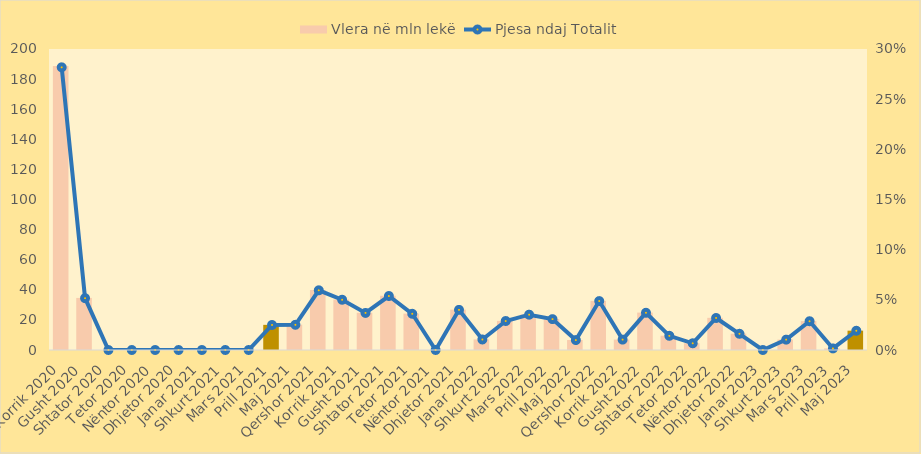
| Category | Vlera në mln lekë |
|---|---|
| Korrik 2020 | 188.7 |
| Gusht 2020 | 34.6 |
| Shtator 2020 | 0 |
| Tetor 2020 | 0 |
| Nëntor 2020 | 0 |
| Dhjetor 2020 | 0 |
| Janar 2021 | 0 |
| Shkurt 2021 | 0 |
| Mars 2021 | 0 |
| Prill 2021 | 16.709 |
| Maj 2021 | 16.827 |
| Qershor 2021 | 39.848 |
| Korrik 2021 | 33.536 |
| Gusht 2021 | 24.753 |
| Shtator 2021 | 36.031 |
| Tetor 2021 | 24.173 |
| Nëntor 2021 | 0 |
| Dhjetor 2021 | 26.801 |
| Janar 2022 | 7.027 |
| Shkurt 2022 | 19.349 |
| Mars 2022 | 23.574 |
| Prill 2022 | 20.609 |
| Maj 2022 | 6.626 |
| Qershor 2022 | 32.661 |
| Korrik 2022 | 6.931 |
| Gusht 2022 | 24.85 |
| Shtator 2022 | 9.475 |
| Tetor 2022 | 4.483 |
| Nëntor 2022 | 21.374 |
| Dhjetor 2022 | 10.824 |
| Janar 2023 | 0 |
| Shkurt 2023 | 6.911 |
| Mars 2023 | 19.201 |
| Prill 2023 | 1.047 |
| Maj 2023 | 12.847 |